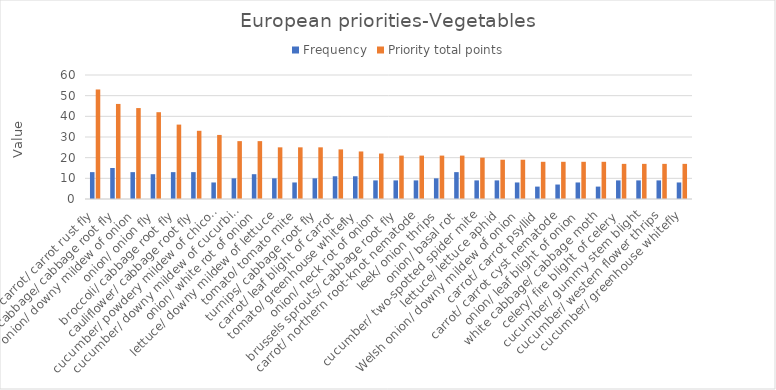
| Category | Frequency | Priority total points |
|---|---|---|
| carrot/ carrot rust fly | 13 | 53 |
| white cabbage/ cabbage root fly | 15 | 46 |
| onion/ downy mildew of onion | 13 | 44 |
| onion/ onion fly | 12 | 42 |
| broccoli/ cabbage root fly | 13 | 36 |
| cauliflower/ cabbage root fly | 13 | 33 |
| cucumber/ powdery mildew of chicory | 8 | 31 |
| cucumber/ downy mildew of cucurbits | 10 | 28 |
| onion/ white rot of onion | 12 | 28 |
| lettuce/ downy mildew of lettuce | 10 | 25 |
| tomato/ tomato mite | 8 | 25 |
| turnips/ cabbage root fly | 10 | 25 |
| carrot/ leaf blight of carrot | 11 | 24 |
| tomato/ greenhouse whitefly | 11 | 23 |
| onion/ neck rot of onion | 9 | 22 |
| brussels sprouts/ cabbage root fly | 9 | 21 |
| carrot/ northern root-knot nematode | 9 | 21 |
| leek/ onion thrips | 10 | 21 |
| onion/ basal rot | 13 | 21 |
| cucumber/ two-spotted spider mite | 9 | 20 |
| lettuce/ lettuce aphid | 9 | 19 |
| Welsh onion/ downy mildew of onion | 8 | 19 |
| carrot/ carrot psyllid | 6 | 18 |
| carrot/ carrot cyst nematode | 7 | 18 |
| onion/ leaf blight of onion | 8 | 18 |
| white cabbage/ cabbage moth | 6 | 18 |
| celery/ fire blight of celery | 9 | 17 |
| cucumber/ gummy stem blight | 9 | 17 |
| cucumber/ western flower thrips | 9 | 17 |
| cucumber/ greenhouse whitefly | 8 | 17 |